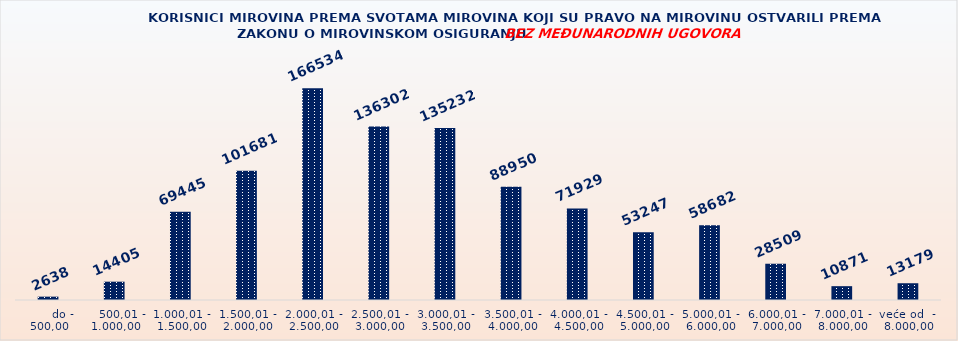
| Category | KORISNICI MIROVINA PREMA VRSTAMA I SVOTAMA MIROVINA KOJI SU PRAVO NA MIROVINU OSTVARILI PREMA ZAKONU O MIROVINSKOM OSIGURANJU 
BEZ MEĐUNARODNIH UGOVORA |
|---|---|
|       do - 500,00 | 2638 |
|    500,01 - 1.000,00 | 14405 |
| 1.000,01 - 1.500,00 | 69445 |
| 1.500,01 - 2.000,00 | 101681 |
| 2.000,01 - 2.500,00 | 166534 |
| 2.500,01 - 3.000,00 | 136302 |
| 3.000,01 - 3.500,00 | 135232 |
| 3.500,01 - 4.000,00 | 88950 |
| 4.000,01 - 4.500,00 | 71929 |
| 4.500,01 - 5.000,00 | 53247 |
| 5.000,01 - 6.000,00 | 58682 |
| 6.000,01 - 7.000,00 | 28509 |
| 7.000,01 - 8.000,00 | 10871 |
| veće od  -  8.000,00 | 13179 |